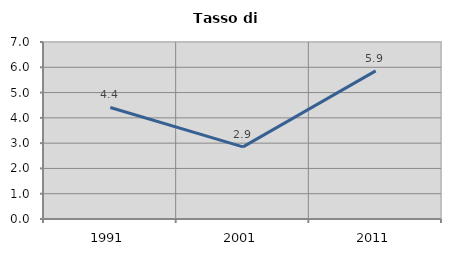
| Category | Tasso di disoccupazione   |
|---|---|
| 1991.0 | 4.41 |
| 2001.0 | 2.854 |
| 2011.0 | 5.859 |